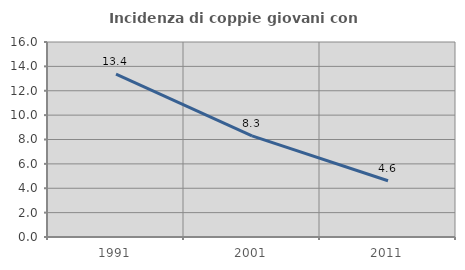
| Category | Incidenza di coppie giovani con figli |
|---|---|
| 1991.0 | 13.355 |
| 2001.0 | 8.3 |
| 2011.0 | 4.617 |